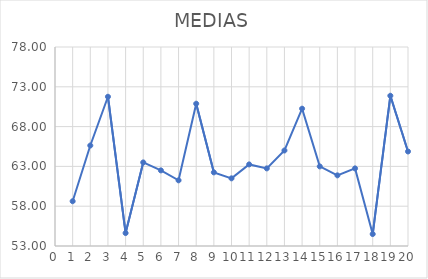
| Category | Series 0 |
|---|---|
| 1.0 | 58.625 |
| 2.0 | 65.625 |
| 3.0 | 71.75 |
| 4.0 | 54.625 |
| 5.0 | 63.5 |
| 6.0 | 62.5 |
| 7.0 | 61.25 |
| 8.0 | 70.875 |
| 9.0 | 62.25 |
| 10.0 | 61.5 |
| 11.0 | 63.25 |
| 12.0 | 62.75 |
| 13.0 | 65 |
| 14.0 | 70.25 |
| 15.0 | 63 |
| 16.0 | 61.875 |
| 17.0 | 62.75 |
| 18.0 | 54.5 |
| 19.0 | 71.875 |
| 20.0 | 64.875 |